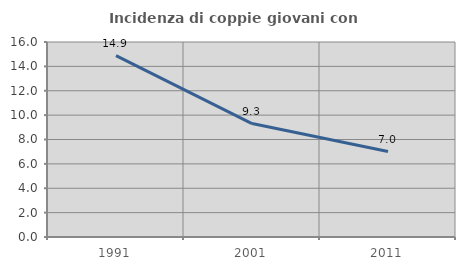
| Category | Incidenza di coppie giovani con figli |
|---|---|
| 1991.0 | 14.886 |
| 2001.0 | 9.309 |
| 2011.0 | 7.015 |